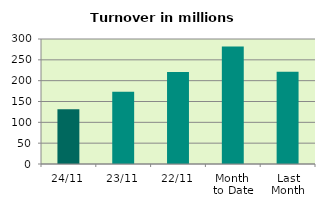
| Category | Series 0 |
|---|---|
| 24/11 | 131.693 |
| 23/11 | 173.522 |
| 22/11 | 220.673 |
| Month 
to Date | 281.77 |
| Last
Month | 221.516 |